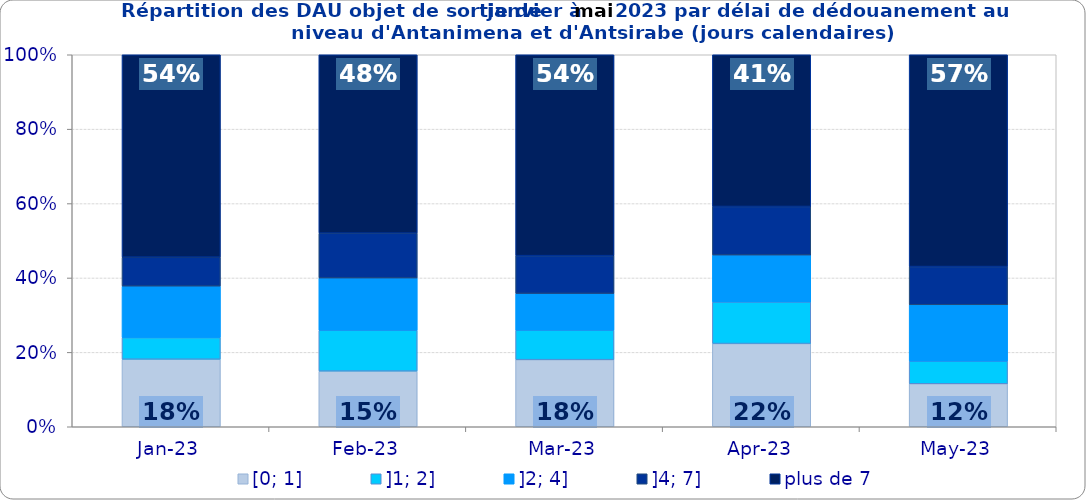
| Category | [0; 1] | ]1; 2] | ]2; 4] | ]4; 7] | plus de 7 |
|---|---|---|---|---|---|
| 2023-01-01 | 0.182 | 0.058 | 0.138 | 0.078 | 0.544 |
| 2023-02-01 | 0.15 | 0.11 | 0.141 | 0.121 | 0.479 |
| 2023-03-01 | 0.18 | 0.079 | 0.099 | 0.102 | 0.54 |
| 2023-04-01 | 0.224 | 0.112 | 0.126 | 0.13 | 0.408 |
| 2023-05-01 | 0.116 | 0.061 | 0.152 | 0.103 | 0.569 |